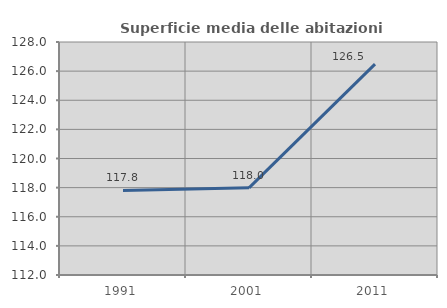
| Category | Superficie media delle abitazioni occupate |
|---|---|
| 1991.0 | 117.803 |
| 2001.0 | 117.987 |
| 2011.0 | 126.483 |